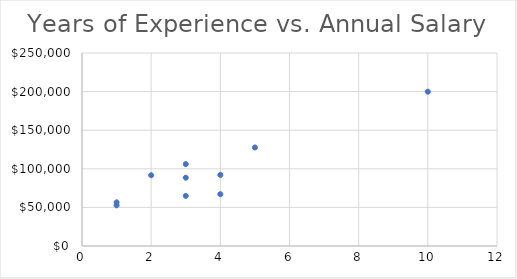
| Category | Series 0 |
|---|---|
| 1.0 | 52621 |
| 3.0 | 106079 |
| 4.0 | 92058 |
| 4.0 | 67114 |
| 1.0 | 56565 |
| 3.0 | 64937 |
| 5.0 | 127626 |
| 3.0 | 88478 |
| 2.0 | 91679 |
| 10.0 | 199848 |